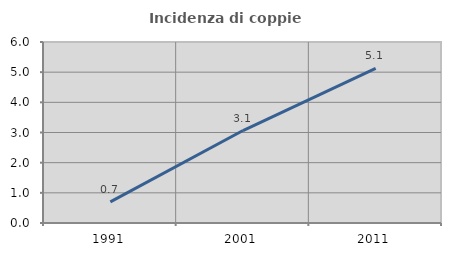
| Category | Incidenza di coppie miste |
|---|---|
| 1991.0 | 0.702 |
| 2001.0 | 3.066 |
| 2011.0 | 5.122 |